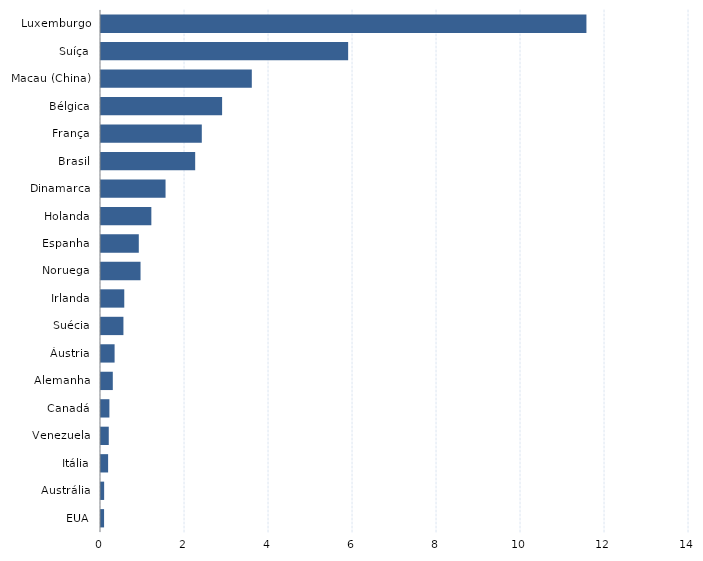
| Category | Series 0 |
|---|---|
| EUA | 0.073 |
| Austrália | 0.075 |
| Itália | 0.169 |
| Venezuela | 0.185 |
| Canadá | 0.2 |
| Alemanha | 0.281 |
| Áustria | 0.324 |
| Suécia | 0.534 |
| Irlanda | 0.554 |
| Noruega | 0.941 |
| Espanha | 0.9 |
| Holanda | 1.199 |
| Dinamarca | 1.537 |
| Brasil | 2.243 |
| França | 2.4 |
| Bélgica | 2.883 |
| Macau (China) | 3.591 |
| Suíça | 5.884 |
| Luxemburgo | 11.558 |